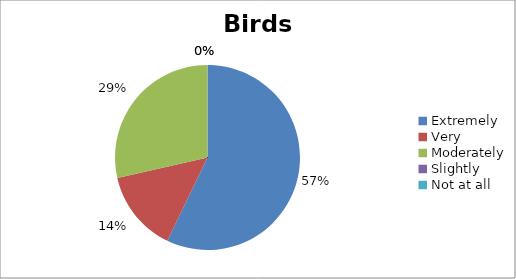
| Category | Birds |
|---|---|
| Extremely | 4 |
| Very | 1 |
| Moderately | 2 |
| Slightly | 0 |
| Not at all | 0 |